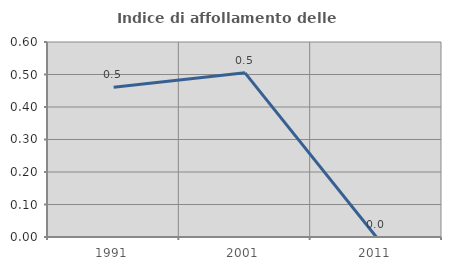
| Category | Indice di affollamento delle abitazioni  |
|---|---|
| 1991.0 | 0.461 |
| 2001.0 | 0.505 |
| 2011.0 | 0 |